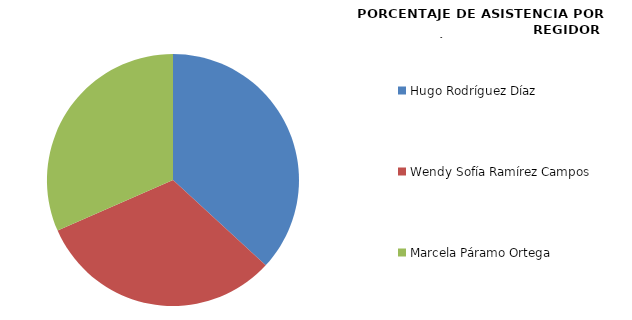
| Category | Series 0 |
|---|---|
| Hugo Rodríguez Díaz  | 100 |
| Wendy Sofía Ramírez Campos | 85.714 |
| Marcela Páramo Ortega | 85.714 |